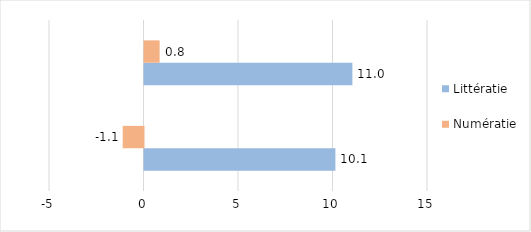
| Category | Littératie | Numératie |
|---|---|---|
| France | 10.1 | -1.1 |
| Académie | 11 | 0.8 |